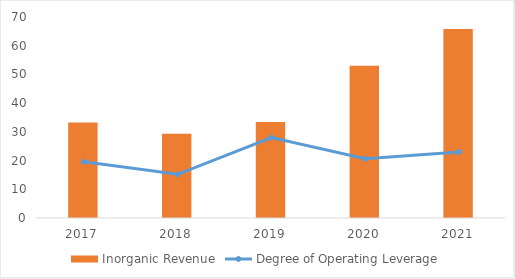
| Category | Inorganic Revenue |
|---|---|
| 2017.0 | 33.301 |
| 2018.0 | 29.353 |
| 2019.0 | 33.439 |
| 2020.0 | 53.046 |
| 2021.0 | 65.862 |